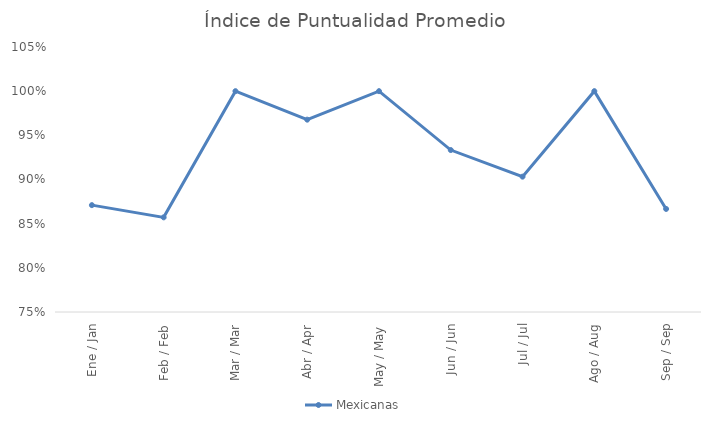
| Category | Mexicanas |
|---|---|
| Ene / Jan | 0.871 |
| Feb / Feb | 0.857 |
| Mar / Mar | 1 |
| Abr / Apr | 0.968 |
| May / May | 1 |
| Jun / Jun | 0.933 |
| Jul / Jul | 0.903 |
| Ago / Aug | 1 |
| Sep / Sep | 0.867 |